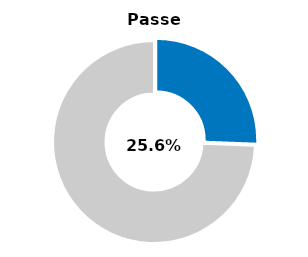
| Category | Series 0 |
|---|---|
| Passed | 0.256 |
| Other | 0.744 |